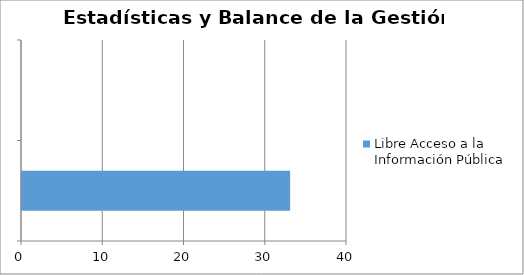
| Category | Libre Acceso a la Información Pública |
|---|---|
|  | 33 |
|  | 0 |